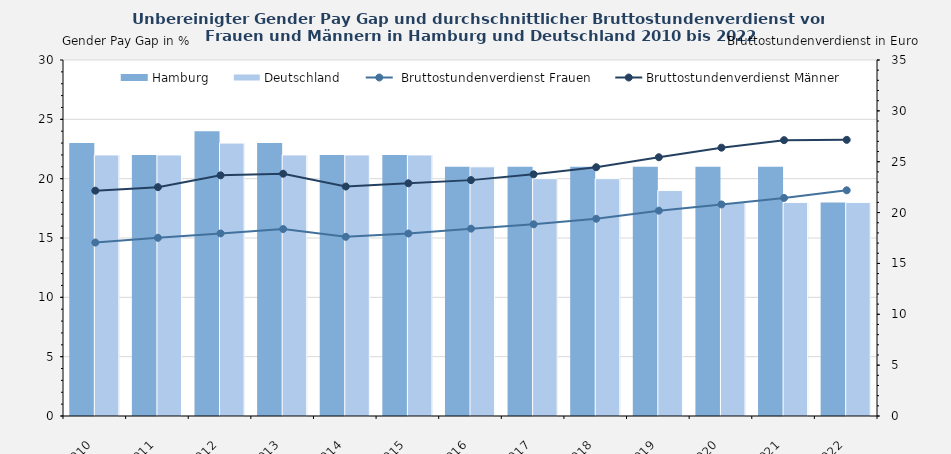
| Category | Hamburg | Deutschland |
|---|---|---|
| 2010.0 | 23 | 22 |
| 2011.0 | 22 | 22 |
| 2012.0 | 24 | 23 |
| 2013.0 | 23 | 22 |
| 2014.0 | 22 | 22 |
| 2015.0 | 22 | 22 |
| 2016.0 | 21 | 21 |
| 2017.0 | 21 | 20 |
| 2018.0 | 21 | 20 |
| 2019.0 | 21 | 19 |
| 2020.0 | 21 | 18 |
| 2021.0 | 21 | 18 |
| 2022.0 | 18 | 18 |